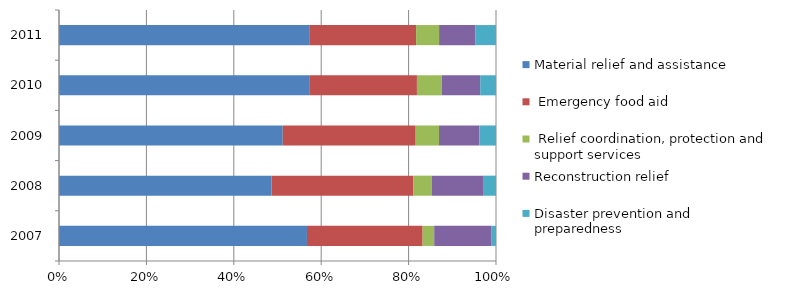
| Category | Material relief and assistance |  Emergency food aid |  Relief coordination, protection and support services | Reconstruction relief | Disaster prevention and preparedness |
|---|---|---|---|---|---|
| 2007.0 | 5023.112 | 2343.229 | 234.424 | 1163.508 | 88.181 |
| 2008.0 | 5588.206 | 3733.582 | 477.56 | 1350.459 | 340.888 |
| 2009.0 | 5707.794 | 3391.162 | 595.603 | 1027.026 | 426.103 |
| 2010.0 | 6687.713 | 2854.332 | 663.15 | 1023.754 | 421.019 |
| 2011.0 | 6512.607 | 2781.241 | 599.084 | 948.795 | 531.964 |